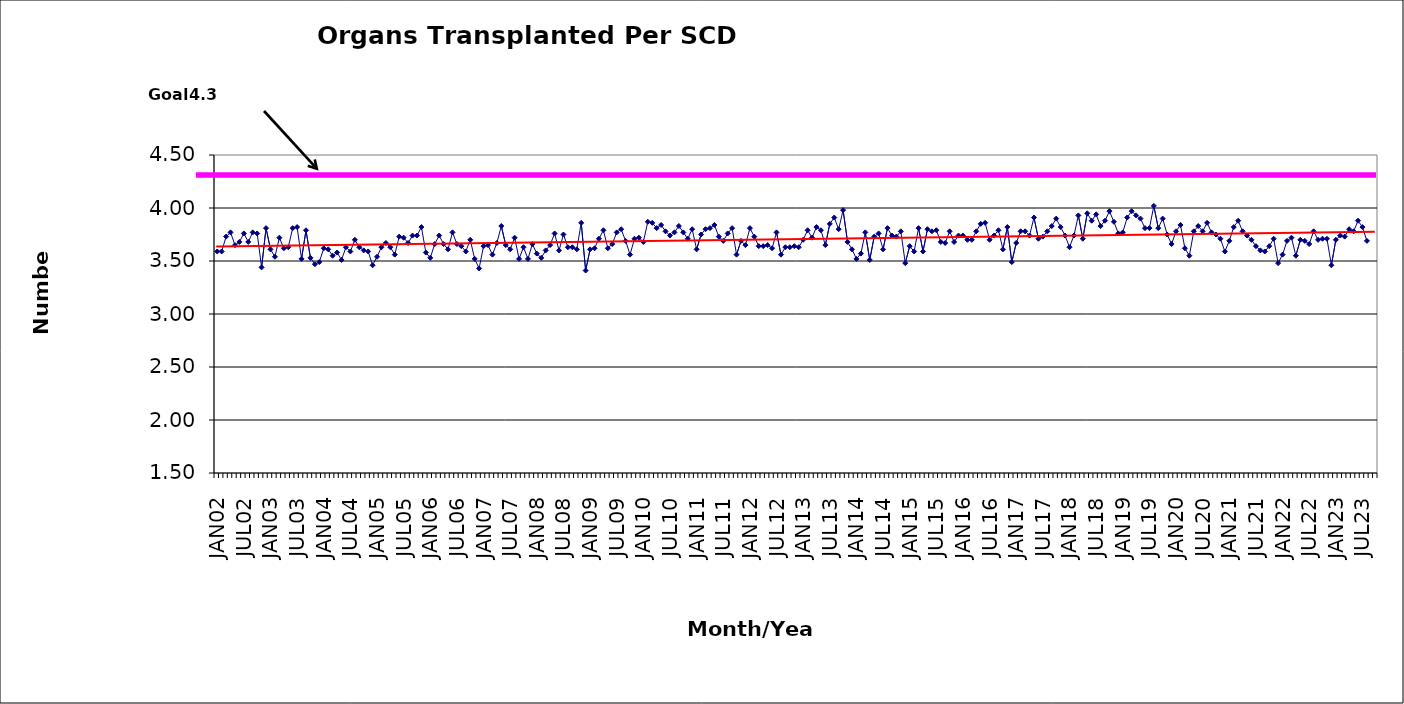
| Category | Series 0 |
|---|---|
| JAN02 | 3.59 |
| FEB02 | 3.59 |
| MAR02 | 3.73 |
| APR02 | 3.77 |
| MAY02 | 3.65 |
| JUN02 | 3.68 |
| JUL02 | 3.76 |
| AUG02 | 3.68 |
| SEP02 | 3.77 |
| OCT02 | 3.76 |
| NOV02 | 3.44 |
| DEC02 | 3.81 |
| JAN03 | 3.61 |
| FEB03 | 3.54 |
| MAR03 | 3.72 |
| APR03 | 3.62 |
| MAY03 | 3.63 |
| JUN03 | 3.81 |
| JUL03 | 3.82 |
| AUG03 | 3.52 |
| SEP03 | 3.79 |
| OCT03 | 3.53 |
| NOV03 | 3.47 |
| DEC03 | 3.49 |
| JAN04 | 3.62 |
| FEB04 | 3.61 |
| MAR04 | 3.55 |
| APR04 | 3.58 |
| MAY04 | 3.51 |
| JUN04 | 3.63 |
| JUL04 | 3.59 |
| AUG04 | 3.7 |
| SEP04 | 3.63 |
| OCT04 | 3.6 |
| NOV04 | 3.59 |
| DEC04 | 3.46 |
| JAN05 | 3.54 |
| FEB05 | 3.63 |
| MAR05 | 3.67 |
| APR05 | 3.63 |
| MAY05 | 3.56 |
| JUN05 | 3.73 |
| JUL05 | 3.72 |
| AUG05 | 3.67 |
| SEP05 | 3.74 |
| OCT05 | 3.74 |
| NOV05 | 3.82 |
| DEC05 | 3.58 |
| JAN06 | 3.53 |
| FEB06 | 3.66 |
| MAR06 | 3.74 |
| APR06 | 3.66 |
| MAY06 | 3.61 |
| JUN06 | 3.77 |
| JUL06 | 3.66 |
| AUG06 | 3.64 |
| SEP06 | 3.59 |
| OCT06 | 3.7 |
| NOV06 | 3.52 |
| DEC06 | 3.43 |
| JAN07 | 3.64 |
| FEB07 | 3.65 |
| MAR07 | 3.56 |
| APR07 | 3.67 |
| MAY07 | 3.83 |
| JUN07 | 3.65 |
| JUL07 | 3.61 |
| AUG07 | 3.72 |
| SEP07 | 3.52 |
| OCT07 | 3.63 |
| NOV07 | 3.52 |
| DEC07 | 3.66 |
| JAN08 | 3.57 |
| FEB08 | 3.53 |
| MAR08 | 3.6 |
| APR08 | 3.65 |
| MAY08 | 3.76 |
| JUN08 | 3.6 |
| JUL08 | 3.75 |
| AUG08 | 3.63 |
| SEP08 | 3.63 |
| OCT08 | 3.61 |
| NOV08 | 3.86 |
| DEC08 | 3.41 |
| JAN09 | 3.61 |
| FEB09 | 3.62 |
| MAR09 | 3.71 |
| APR09 | 3.79 |
| MAY09 | 3.62 |
| JUN09 | 3.66 |
| JUL09 | 3.77 |
| AUG09 | 3.8 |
| SEP09 | 3.69 |
| OCT09 | 3.56 |
| NOV09 | 3.71 |
| DEC09 | 3.72 |
| JAN10 | 3.68 |
| FEB10 | 3.87 |
| MAR10 | 3.86 |
| APR10 | 3.81 |
| MAY10 | 3.84 |
| JUN10 | 3.78 |
| JUL10 | 3.74 |
| AUG10 | 3.77 |
| SEP10 | 3.83 |
| OCT10 | 3.77 |
| NOV10 | 3.71 |
| DEC10 | 3.8 |
| JAN11 | 3.61 |
| FEB11 | 3.75 |
| MAR11 | 3.8 |
| APR11 | 3.81 |
| MAY11 | 3.84 |
| JUN11 | 3.73 |
| JUL11 | 3.69 |
| AUG11 | 3.76 |
| SEP11 | 3.81 |
| OCT11 | 3.56 |
| NOV11 | 3.69 |
| DEC11 | 3.65 |
| JAN12 | 3.81 |
| FEB12 | 3.73 |
| MAR12 | 3.64 |
| APR12 | 3.64 |
| MAY12 | 3.65 |
| JUN12 | 3.62 |
| JUL12 | 3.77 |
| AUG12 | 3.56 |
| SEP12 | 3.63 |
| OCT12 | 3.63 |
| NOV12 | 3.64 |
| DEC12 | 3.63 |
| JAN13 | 3.7 |
| FEB13 | 3.79 |
| MAR13 | 3.72 |
| APR13 | 3.82 |
| MAY13 | 3.79 |
| JUN13 | 3.65 |
| JUL13 | 3.85 |
| AUG13 | 3.91 |
| SEP13 | 3.8 |
| OCT13 | 3.98 |
| NOV13 | 3.68 |
| DEC13 | 3.61 |
| JAN14 | 3.52 |
| FEB14 | 3.57 |
| MAR14 | 3.77 |
| APR14 | 3.51 |
| MAY14 | 3.73 |
| JUN14 | 3.76 |
| JUL14 | 3.61 |
| AUG14 | 3.81 |
| SEP14 | 3.74 |
| OCT14 | 3.73 |
| NOV14 | 3.78 |
| DEC14 | 3.48 |
| JAN15 | 3.64 |
| FEB15 | 3.59 |
| MAR15 | 3.81 |
| APR15 | 3.59 |
| MAY15 | 3.8 |
| JUN15 | 3.78 |
| JUL15 | 3.79 |
| AUG15 | 3.68 |
| SEP15 | 3.67 |
| OCT15 | 3.78 |
| NOV15 | 3.68 |
| DEC15 | 3.74 |
| JAN16 | 3.74 |
| FEB16 | 3.7 |
| MAR16 | 3.7 |
| APR16 | 3.78 |
| MAY16 | 3.85 |
| JUN16 | 3.86 |
| JUL16 | 3.7 |
| AUG16 | 3.74 |
| SEP16 | 3.79 |
| OCT16 | 3.61 |
| NOV16 | 3.82 |
| DEC16 | 3.49 |
| JAN17 | 3.67 |
| FEB17 | 3.78 |
| MAR17 | 3.78 |
| APR17 | 3.74 |
| MAY17 | 3.91 |
| JUN17 | 3.71 |
| JUL17 | 3.73 |
| AUG17 | 3.78 |
| SEP17 | 3.83 |
| OCT17 | 3.9 |
| NOV17 | 3.82 |
| DEC17 | 3.74 |
| JAN18 | 3.63 |
| FEB18 | 3.74 |
| MAR18 | 3.93 |
| APR18 | 3.71 |
| MAY18 | 3.95 |
| JUN18 | 3.88 |
| JUL18 | 3.94 |
| AUG18 | 3.83 |
| SEP18 | 3.88 |
| OCT18 | 3.97 |
| NOV18 | 3.87 |
| DEC18 | 3.76 |
| JAN19 | 3.77 |
| FEB19 | 3.91 |
| MAR19 | 3.97 |
| APR19 | 3.93 |
| MAY19 | 3.9 |
| JUN19 | 3.81 |
| JUL19 | 3.81 |
| AUG19 | 4.02 |
| SEP19 | 3.81 |
| OCT19 | 3.9 |
| NOV19 | 3.75 |
| DEC19 | 3.66 |
| JAN20 | 3.78 |
| FEB20 | 3.84 |
| MAR20 | 3.62 |
| APR20 | 3.55 |
| MAY20 | 3.78 |
| JUN20 | 3.83 |
| JUL20 | 3.78 |
| AUG20 | 3.86 |
| SEP20 | 3.77 |
| OCT20 | 3.75 |
| NOV20 | 3.71 |
| DEC20 | 3.59 |
| JAN21 | 3.69 |
| FEB21 | 3.82 |
| MAR21 | 3.88 |
| APR21 | 3.78 |
| MAY21 | 3.74 |
| JUN21 | 3.7 |
| JUL21 | 3.64 |
| AUG21 | 3.6 |
| SEP21 | 3.59 |
| OCT21 | 3.64 |
| NOV21 | 3.71 |
| DEC21 | 3.48 |
| JAN22 | 3.56 |
| FEB22 | 3.69 |
| MAR22 | 3.72 |
| APR22 | 3.55 |
| MAY22 | 3.7 |
| JUN22 | 3.69 |
| JUL22 | 3.66 |
| AUG22 | 3.78 |
| SEP22 | 3.7 |
| OCT22 | 3.71 |
| NOV22 | 3.71 |
| DEC22 | 3.46 |
| JAN23 | 3.7 |
| FEB23 | 3.74 |
| MAR23 | 3.73 |
| APR23 | 3.8 |
| MAY23 | 3.78 |
| JUN23 | 3.88 |
| JUL23 | 3.82 |
| AUG23 | 3.69 |